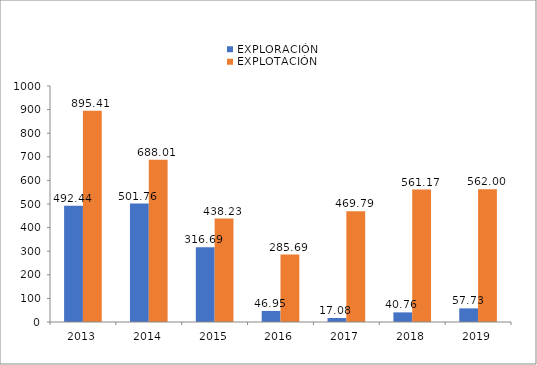
| Category | EXPLORACIÓN | EXPLOTACIÓN |
|---|---|---|
| 2013.0 | 492.44 | 895.41 |
| 2014.0 | 501.76 | 688.01 |
| 2015.0 | 316.69 | 438.23 |
| 2016.0 | 46.95 | 285.69 |
| 2017.0 | 17.08 | 469.79 |
| 2018.0 | 40.76 | 561.17 |
| 2019.0 | 57.728 | 561.997 |